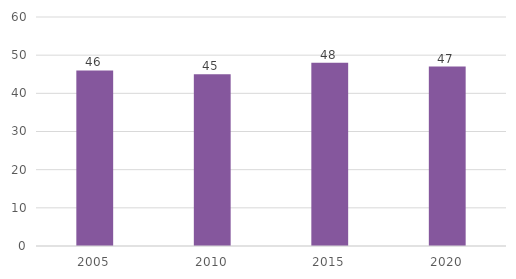
| Category | Taux accès |
|---|---|
| 2005.0 | 46 |
| 2010.0 | 45 |
| 2015.0 | 48 |
| 2020.0 | 47 |